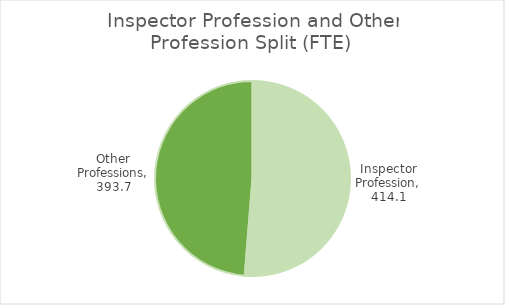
| Category | FTE |
|---|---|
| Inspector Profession | 414.051 |
| Other Professions | 393.707 |